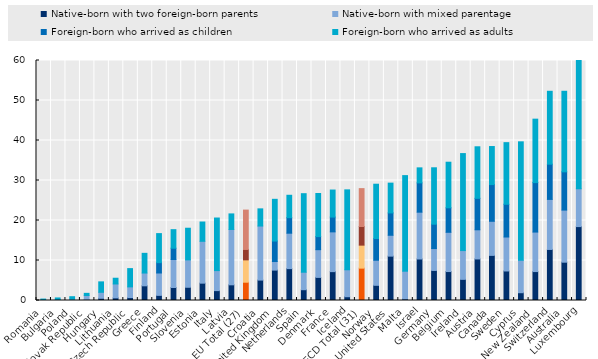
| Category | Native-born with two foreign-born parents | Native-born with mixed parentage | Foreign-born who arrived as children | Foreign-born who arrived as adults |
|---|---|---|---|---|
| Romania | 0.003 | 0.071 | 0 | 0.283 |
| Bulgaria | 0.017 | 0.249 | 0 | 0.375 |
| Poland | 0.046 | 0.291 | 0 | 0.612 |
| Slovak Republic | 0.104 | 1.145 | 0 | 0.539 |
| Hungary | 0.555 | 1.497 | 0 | 2.604 |
| Lithuania | 0.659 | 3.475 | 0 | 1.432 |
| Czech Republic | 0.729 | 2.676 | 0 | 4.568 |
| Greece | 3.672 | 3.193 | 0 | 4.925 |
| Finland | 1.282 | 5.596 | 2.583 | 7.263 |
| Portugal | 3.249 | 7.001 | 2.82 | 4.638 |
| Slovenia | 3.305 | 6.851 | 0 | 7.911 |
| Estonia | 4.335 | 10.466 | 0 | 4.818 |
| Italy | 2.473 | 5.003 | 0 | 13.146 |
| Latvia | 3.919 | 13.84 | 0 | 3.889 |
| EU Total (27) | 4.572 | 5.589 | 2.602 | 9.838 |
| Croatia | 5.105 | 13.513 | 0 | 4.291 |
| United Kingdom | 7.597 | 2.144 | 5.12 | 10.434 |
| Netherlands | 7.971 | 8.854 | 3.881 | 5.601 |
| Spain | 2.7 | 4.37 | 0 | 19.634 |
| Denmark | 5.775 | 6.928 | 3.27 | 10.777 |
| France | 7.216 | 9.943 | 3.698 | 6.758 |
| Iceland | 0.945 | 6.738 | 0 | 19.977 |
| OECD Total (31) | 8.089 | 5.751 | 4.658 | 9.472 |
| Norway | 3.798 | 6.268 | 5.422 | 13.584 |
| United States | 11.09 | 5.217 | 5.587 | 7.449 |
| Malta | 0.39 | 6.933 | 0 | 23.9 |
| Israel | 10.375 | 11.704 | 7.325 | 3.756 |
| Germany | 7.513 | 5.471 | 6.09 | 14.103 |
| Belgium | 7.239 | 9.811 | 6.123 | 11.399 |
| Ireland | 5.288 | 7.198 | 0 | 24.244 |
| Austria | 10.388 | 7.289 | 7.866 | 12.889 |
| Canada | 11.279 | 8.525 | 9.179 | 9.511 |
| Sweden | 7.381 | 8.492 | 8.184 | 15.405 |
| Cyprus | 1.946 | 8.119 | 0 | 29.601 |
| New Zealand | 7.232 | 9.876 | 12.364 | 15.863 |
| Switzerland | 12.763 | 12.509 | 8.806 | 18.225 |
| Australia | 9.576 | 13.025 | 9.565 | 20.141 |
| Luxembourg | 18.477 | 9.45 | 0 | 49.183 |